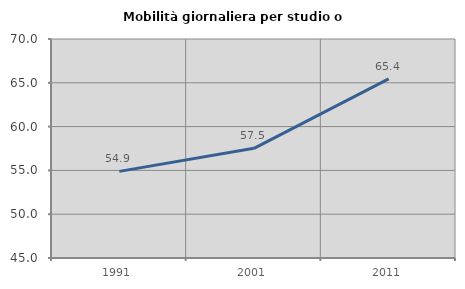
| Category | Mobilità giornaliera per studio o lavoro |
|---|---|
| 1991.0 | 54.889 |
| 2001.0 | 57.52 |
| 2011.0 | 65.445 |